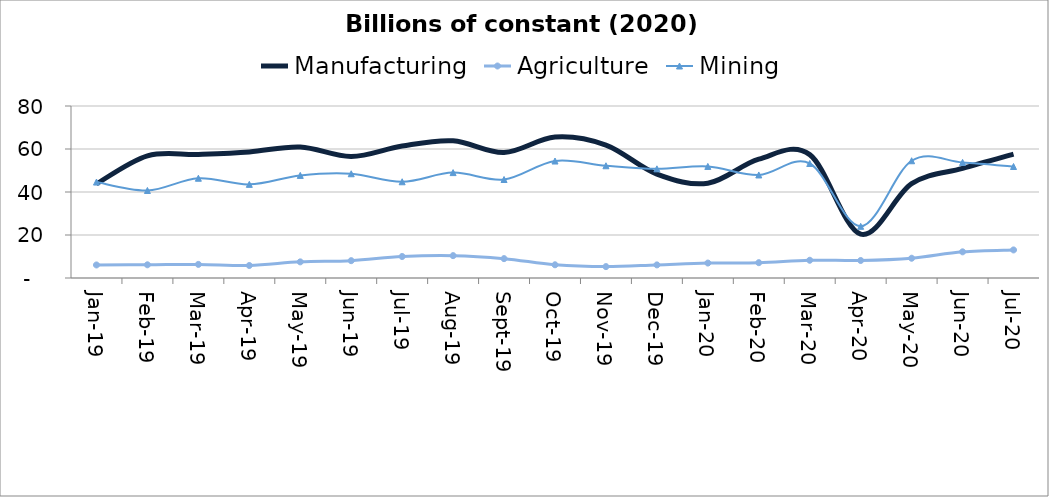
| Category | Manufacturing | Agriculture | Mining |
|---|---|---|---|
| 2019-01-31 | 43.798 | 6.064 | 44.62 |
| 2019-02-28 | 56.834 | 6.145 | 40.711 |
| 2019-03-31 | 57.485 | 6.321 | 46.402 |
| 2019-04-30 | 58.636 | 5.812 | 43.553 |
| 2019-05-31 | 60.948 | 7.505 | 47.723 |
| 2019-06-30 | 56.538 | 8.062 | 48.482 |
| 2019-07-31 | 61.399 | 9.995 | 44.76 |
| 2019-08-31 | 63.816 | 10.405 | 49.02 |
| 2019-09-30 | 58.356 | 9.009 | 45.813 |
| 2019-10-31 | 65.543 | 6.141 | 54.408 |
| 2019-11-30 | 61.802 | 5.294 | 52.206 |
| 2019-12-31 | 48.348 | 6.092 | 50.773 |
| 2020-01-31 | 44.081 | 6.952 | 51.89 |
| 2020-02-29 | 55.254 | 7.125 | 47.925 |
| 2020-03-31 | 57.385 | 8.252 | 53.257 |
| 2020-04-30 | 20.384 | 8.139 | 24.034 |
| 2020-05-31 | 43.852 | 9.187 | 54.528 |
| 2020-06-30 | 50.992 | 12.171 | 53.768 |
| 2020-07-31 | 57.58 | 13.054 | 51.856 |